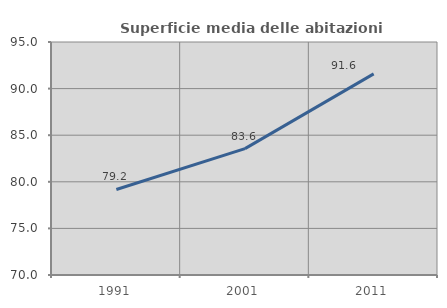
| Category | Superficie media delle abitazioni occupate |
|---|---|
| 1991.0 | 79.179 |
| 2001.0 | 83.557 |
| 2011.0 | 91.581 |